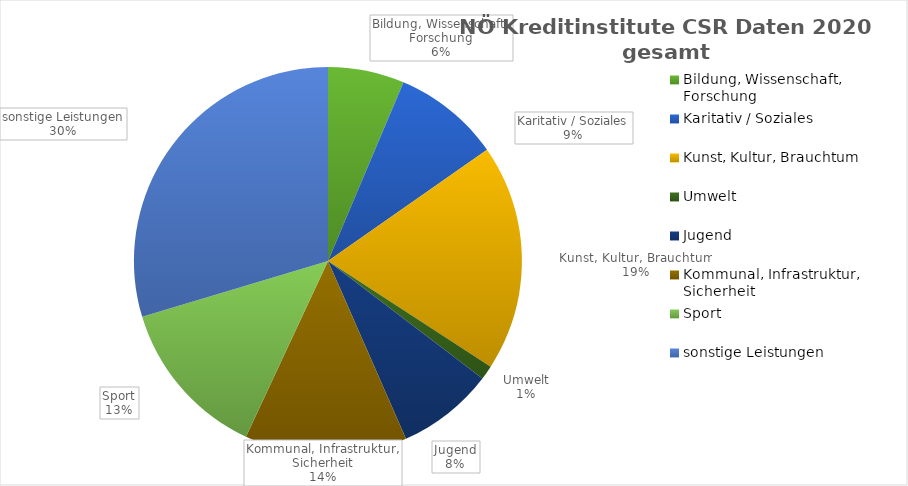
| Category | 9.444.847 Euro Gesamtsumme |
|---|---|
| Bildung, Wissenschaft, Forschung | 601.036 |
| Karitativ / Soziales | 843.176 |
| Kunst, Kultur, Brauchtum | 1783.067 |
| Umwelt | 110.963 |
| Jugend | 762.455 |
| Kommunal, Infrastruktur, Sicherheit | 1278 |
| Sport | 1266.15 |
| sonstige Leistungen | 2800 |